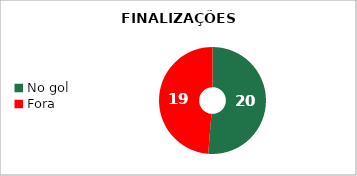
| Category | Series 1 |
|---|---|
| No gol | 20 |
| Fora | 19 |